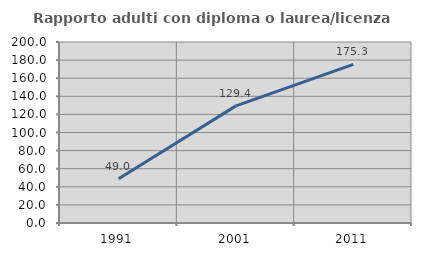
| Category | Rapporto adulti con diploma o laurea/licenza media  |
|---|---|
| 1991.0 | 48.958 |
| 2001.0 | 129.439 |
| 2011.0 | 175.319 |